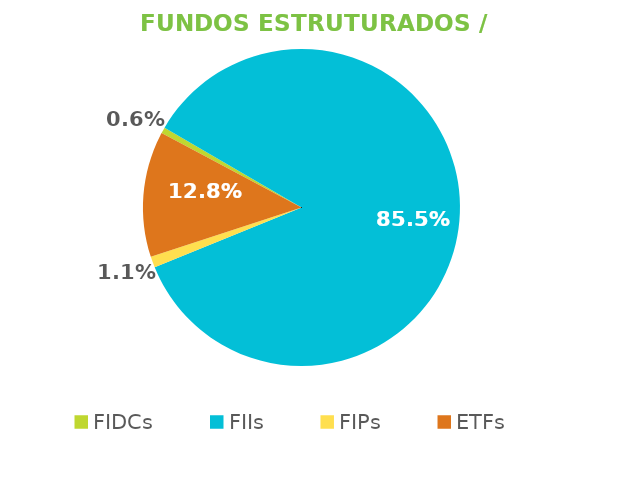
| Category | Fundos Estruturados / ETFs |
|---|---|
| FIDCs | 0.006 |
| FIIs | 0.855 |
| FIPs | 0.011 |
| ETFs | 0.128 |